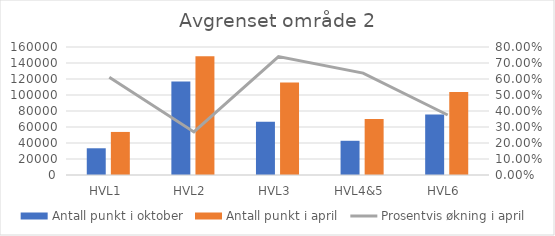
| Category | Antall punkt i oktober  | Antall punkt i april  |
|---|---|---|
| HVL1  | 33411 | 53820 |
| HVL2  | 116910 | 148362 |
| HVL3  | 66526 | 115776 |
| HVL4&5  | 42777 | 70013 |
| HVL6  | 75513 | 103842 |